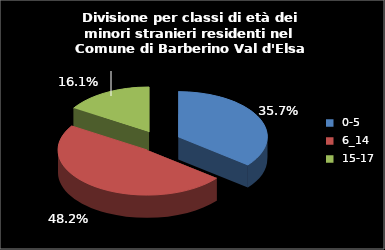
| Category | Series 0 |
|---|---|
| 0-5 | 20 |
| 6_14 | 27 |
| 15-17 | 9 |